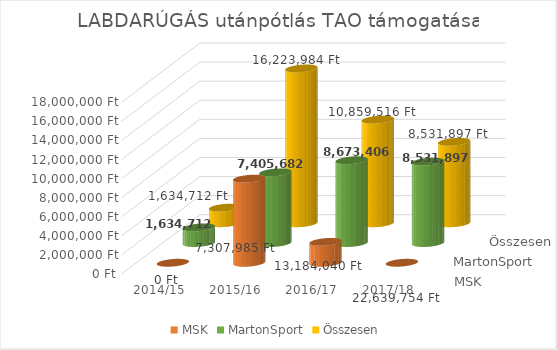
| Category | MSK | MartonSport | Összesen |
|---|---|---|---|
| 2014/15 | 0 | 1634712 | 1634712 |
| 2015/16 | 8818302 | 7405682 | 16223984 |
| 2016/17 | 2186110 | 8673406 | 10859516 |
| 2017/18 | 0 | 8531897 | 8531897 |